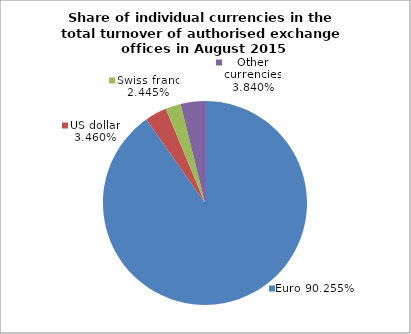
| Category | EUR |
|---|---|
| 0 | 0.903 |
| 1 | 0.035 |
| 2 | 0.024 |
| 3 | 0.038 |